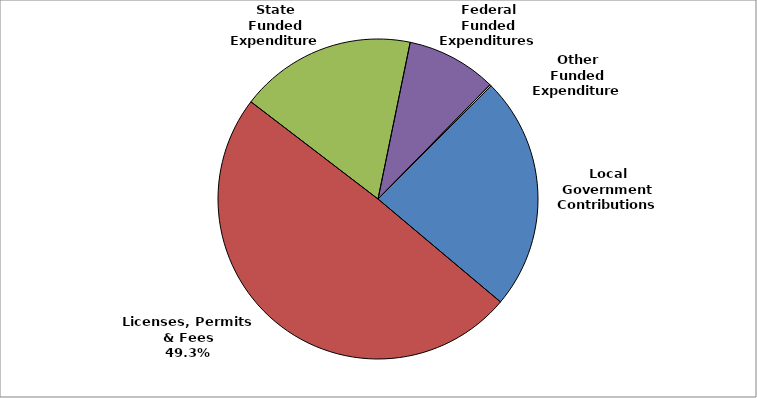
| Category | Series 0 |
|---|---|
| Local Government Contributions | 0.236 |
| Licenses, Permits & Fees | 0.493 |
| State Funded Expenditures | 0.178 |
| Federal Funded Expenditures | 0.091 |
| Other Funded Expenditures | 0.002 |